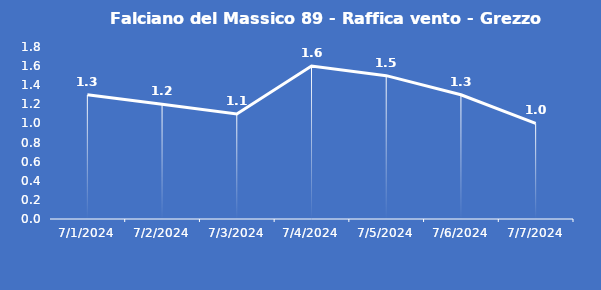
| Category | Falciano del Massico 89 - Raffica vento - Grezzo (m/s) |
|---|---|
| 7/1/24 | 1.3 |
| 7/2/24 | 1.2 |
| 7/3/24 | 1.1 |
| 7/4/24 | 1.6 |
| 7/5/24 | 1.5 |
| 7/6/24 | 1.3 |
| 7/7/24 | 1 |